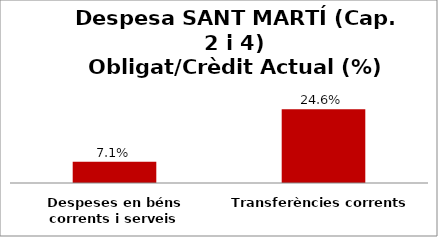
| Category | Series 0 |
|---|---|
| Despeses en béns corrents i serveis | 0.071 |
| Transferències corrents | 0.246 |